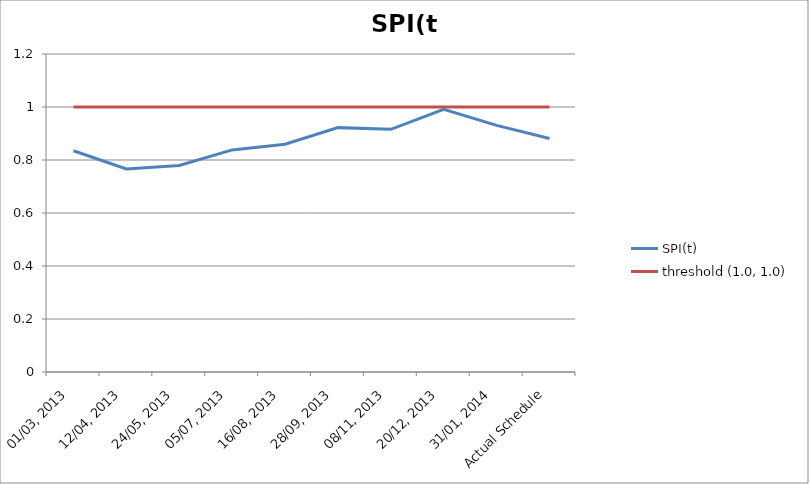
| Category | SPI(t) | threshold (1.0, 1.0) |
|---|---|---|
| 01/03, 2013 | 0.835 | 1 |
| 12/04, 2013 | 0.766 | 1 |
| 24/05, 2013 | 0.779 | 1 |
| 05/07, 2013 | 0.838 | 1 |
| 16/08, 2013 | 0.859 | 1 |
| 28/09, 2013 | 0.922 | 1 |
| 08/11, 2013 | 0.916 | 1 |
| 20/12, 2013 | 0.991 | 1 |
| 31/01, 2014 | 0.931 | 1 |
| Actual Schedule | 0.881 | 1 |